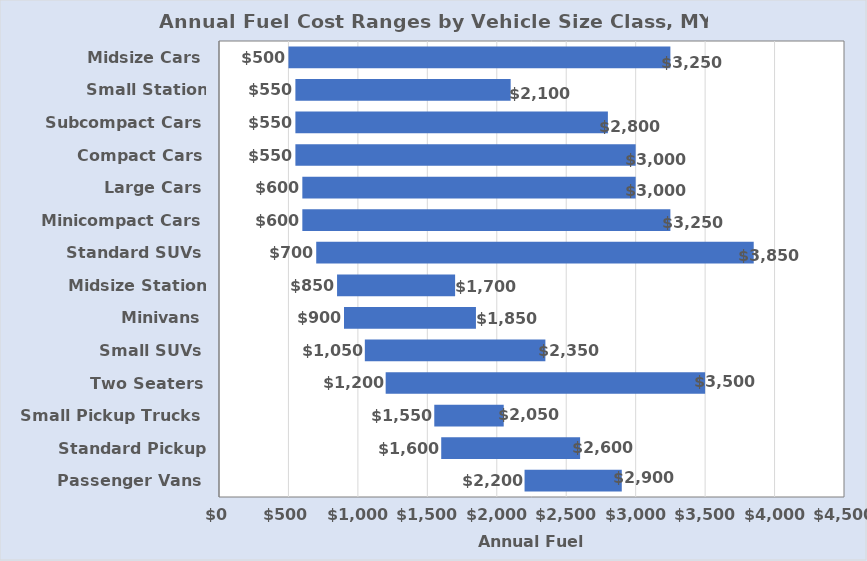
| Category | Minimum Fuel Cost | Maximum Fuel Cost |
|---|---|---|
| Passenger Vans | 2200 | 700 |
| Standard Pickup Trucks | 1600 | 1000 |
| Small Pickup Trucks | 1550 | 500 |
| Two Seaters | 1200 | 2300 |
| Small SUVs | 1050 | 1300 |
| Minivans | 900 | 950 |
| Midsize Station Wagons | 850 | 850 |
| Standard SUVs | 700 | 3150 |
| Minicompact Cars | 600 | 2650 |
| Large Cars | 600 | 2400 |
| Compact Cars | 550 | 2450 |
| Subcompact Cars | 550 | 2250 |
| Small Station Wagons | 550 | 1550 |
| Midsize Cars | 500 | 2750 |